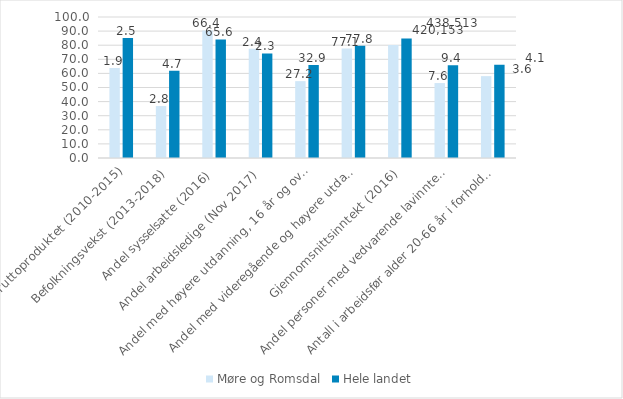
| Category | Møre og Romsdal | Hele landet |
|---|---|---|
| Endring i bruttoproduktet (2010-2015) | 63.759 | 85.077 |
| Befolkningsvekst (2013-2018) | 36.842 | 61.842 |
| Andel sysselsatte (2016) | 90.476 | 84.127 |
| Andel arbeidsledige (Nov 2017) | 77.419 | 74.194 |
| Andel med høyere utdanning, 16 år og over (2016) | 54.509 | 65.932 |
| Andel med videregående og høyere utdanning, 25-29 år (2016) | 77.65 | 79.656 |
| Gjennomsnittsinntekt (2016) | 80.199 | 84.798 |
| Andel personer med vedvarende lavinntekt (2014-16) | 53.147 | 65.734 |
| Antall i arbeidsfør alder 20-66 år i forhold til eldre 67 år og over (2018) | 58.065 | 66.129 |